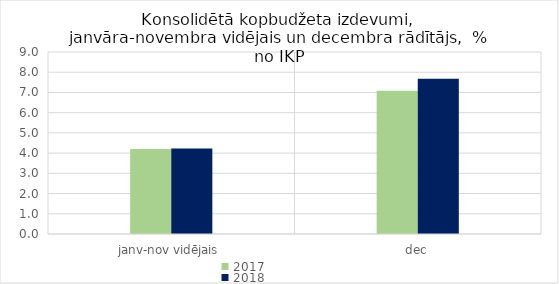
| Category | 2017 | 2018 |
|---|---|---|
| janv-nov vidējais | 4.199 | 4.224 |
| dec | 7.085 | 7.682 |